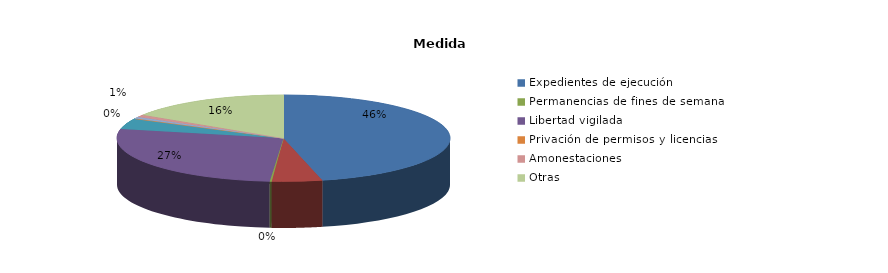
| Category | Series 0 |
|---|---|
| Expedientes de ejecución | 705 |
| Internamientos | 74 |
| Permanencias de fines de semana | 3 |
| Libertad vigilada | 413 |
| Prestaciones en beneficio de la comunidad | 62 |
| Privación de permisos y licencias | 0 |
| Convivencia Familiar Educativa | 10 |
| Amonestaciones | 14 |
| Otras | 243 |